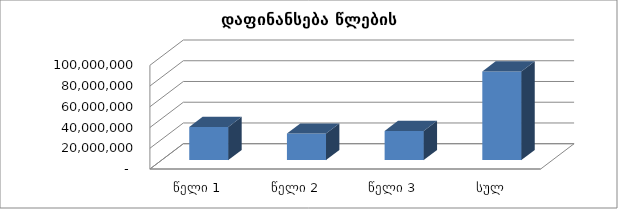
| Category | სულ |
|---|---|
| წელი 1 | 31902162.871 |
| წელი 2 | 25540000 |
| წელი 3 | 28027087.149 |
| სულ | 85469250.021 |